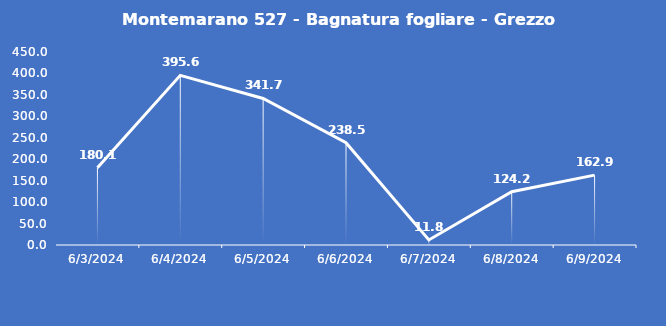
| Category | Montemarano 527 - Bagnatura fogliare - Grezzo (min) |
|---|---|
| 6/3/24 | 180.1 |
| 6/4/24 | 395.6 |
| 6/5/24 | 341.7 |
| 6/6/24 | 238.5 |
| 6/7/24 | 11.8 |
| 6/8/24 | 124.2 |
| 6/9/24 | 162.9 |